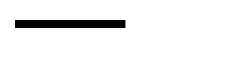
| Category | Series 0 |
|---|---|
| 0 | 0.781 |